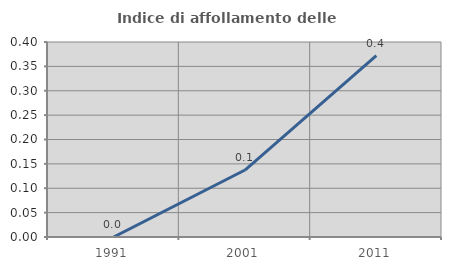
| Category | Indice di affollamento delle abitazioni  |
|---|---|
| 1991.0 | 0 |
| 2001.0 | 0.137 |
| 2011.0 | 0.372 |